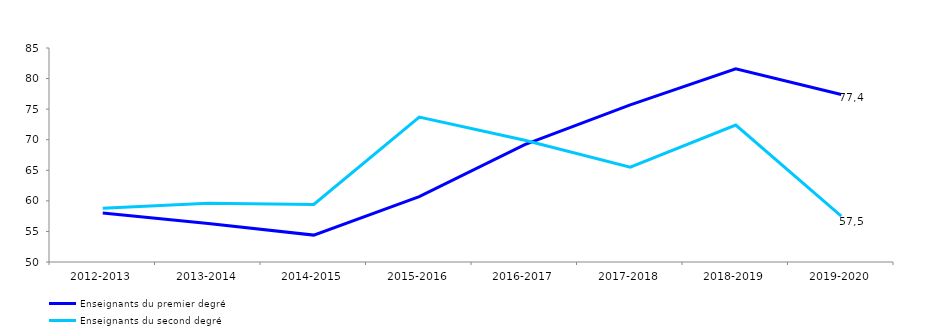
| Category | Enseignants du premier degré | Enseignants du second degré |
|---|---|---|
| 2012-2013 | 58 | 58.8 |
| 2013-2014 | 56.3 | 59.6 |
| 2014-2015 | 54.4 | 59.4 |
| 2015-2016 | 60.7 | 73.7 |
| 2016-2017 | 69.2 | 69.9 |
| 2017-2018 | 75.7 | 65.5 |
| 2018-2019 | 81.6 | 72.4 |
| 2019-2020 | 77.4 | 57.5 |